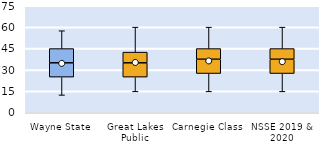
| Category | 25th | 50th | 75th |
|---|---|---|---|
| Wayne State | 25 | 10 | 10 |
| Great Lakes Public | 25 | 10 | 7.5 |
| Carnegie Class | 27.5 | 10 | 7.5 |
| NSSE 2019 & 2020 | 27.5 | 10 | 7.5 |